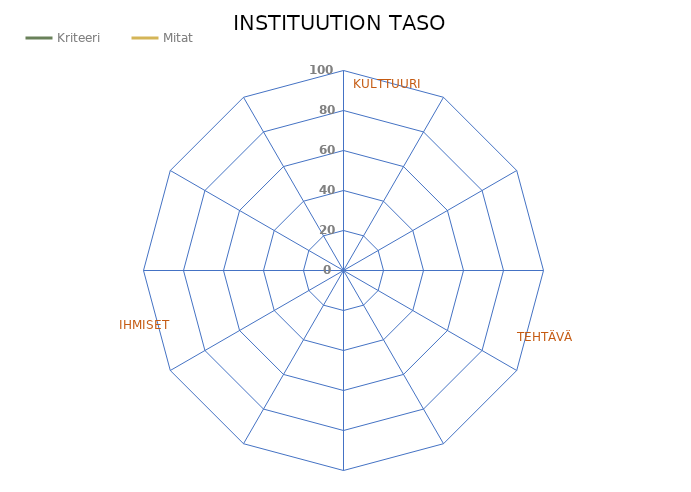
| Category | Kriteeri |
|---|---|
| HALLINTO | 0 |
| STRATEGIA | 0 |
| INKLUSIIVINEN KONTEKSTI | 0 |
| MITTAUS | 0 |
| OPETUSSUUNNITELMAT | 0 |
| TUTKIMUS | 0 |
| TUKITOIMINNOT | 0 |
| RAHOITUS | 0 |
| TUNNISTUS | 0 |
| KONSULTOINTI | 0 |
| OSALLISTUMINEN | 0 |
| YHTEISKEHITTÄMINEN | 0 |